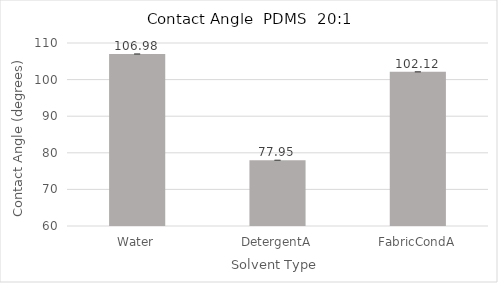
| Category | Series 0 |
|---|---|
| Water | 106.98 |
| DetergentA | 77.95 |
| FabricCondA | 102.117 |